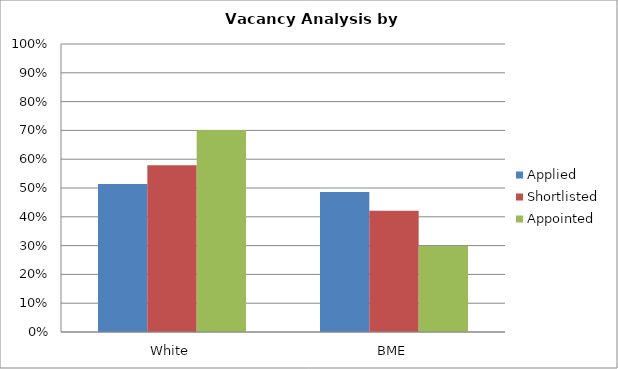
| Category | Applied | Shortlisted | Appointed |
|---|---|---|---|
| White | 0.514 | 0.579 | 0.701 |
| BME | 0.486 | 0.421 | 0.299 |